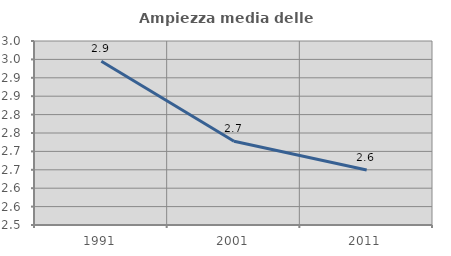
| Category | Ampiezza media delle famiglie |
|---|---|
| 1991.0 | 2.945 |
| 2001.0 | 2.728 |
| 2011.0 | 2.65 |